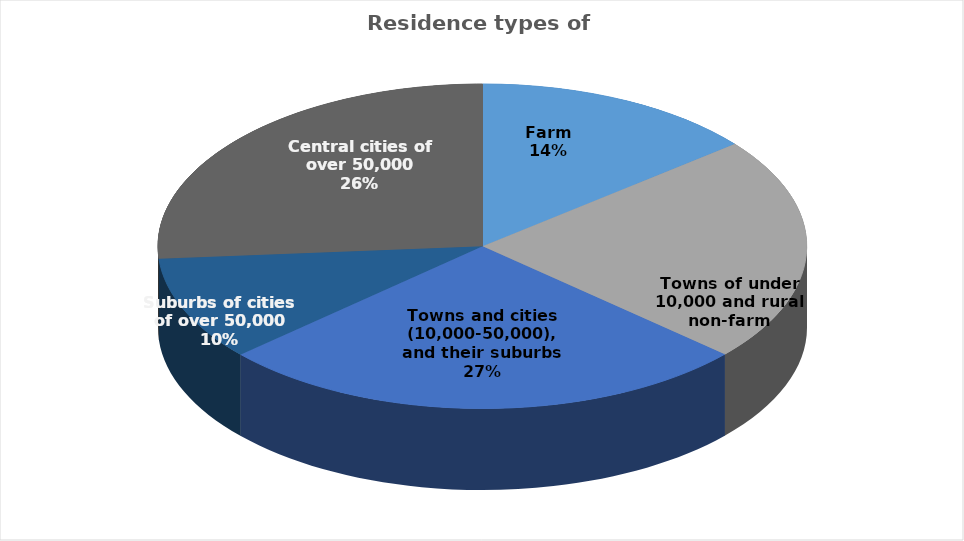
| Category | Series 0 |
|---|---|
| Farm | 12280 |
| Towns of under 10,000 and rural non-farm | 19451 |
| Towns and cities (10,000-50,000), and their suburbs | 23225 |
| Suburbs of cities of over 50,000 | 9025 |
| Central cities of over 50,000 | 22738 |